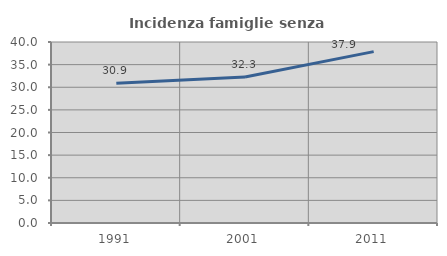
| Category | Incidenza famiglie senza nuclei |
|---|---|
| 1991.0 | 30.907 |
| 2001.0 | 32.261 |
| 2011.0 | 37.869 |